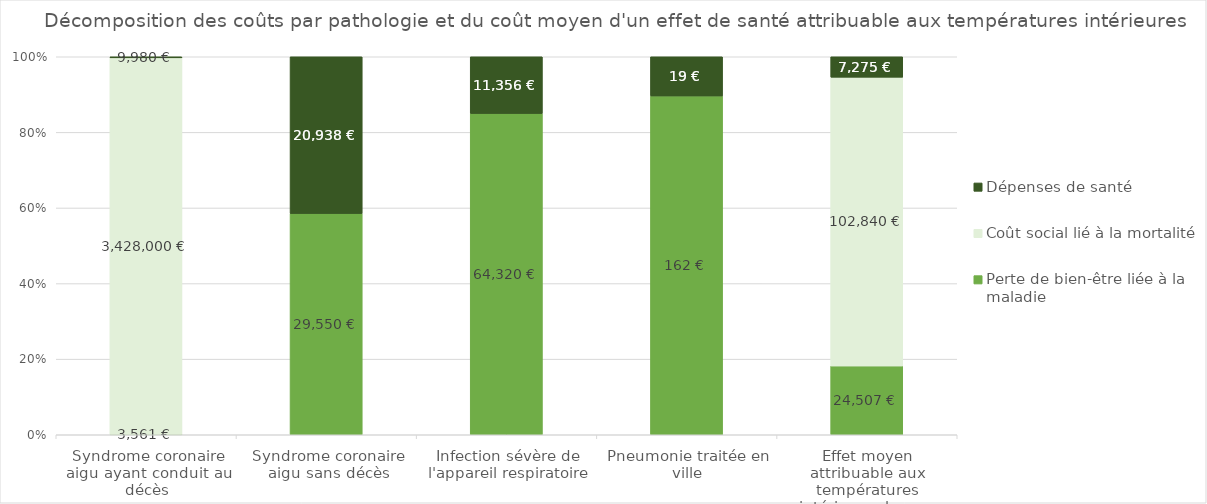
| Category | Perte de bien-être liée à la maladie | Coût social lié à la mortalité | Dépenses de santé |
|---|---|---|---|
| Syndrome coronaire aigu ayant conduit au décès | 3560.709 | 3428000 | 9980 |
| Syndrome coronaire aigu sans décès | 29549.555 | 0 | 20937.832 |
| Infection sévère de l'appareil respiratoire | 64319.753 | 0 | 11356.414 |
| Pneumonie traitée en ville | 162.076 | 0 | 18.749 |
| Effet moyen attribuable aux températures intérieures basses | 24507.21 | 102840 | 7275.13 |